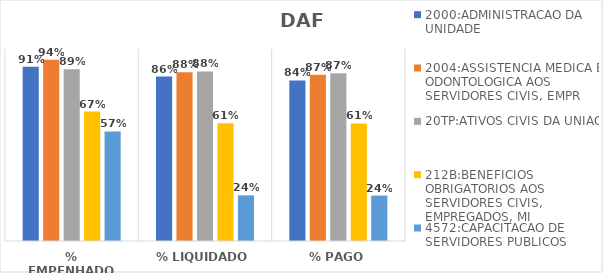
| Category | 2000:ADMINISTRACAO DA UNIDADE | 2004:ASSISTENCIA MEDICA E ODONTOLOGICA AOS SERVIDORES CIVIS, EMPR | 20TP:ATIVOS CIVIS DA UNIAO | 212B:BENEFICIOS OBRIGATORIOS AOS SERVIDORES CIVIS, EMPREGADOS, MI | 4572:CAPACITACAO DE SERVIDORES PUBLICOS FEDERAIS EM PROCESSO DE Q |
|---|---|---|---|---|---|
| % EMPENHADO | 0.908 | 0.945 | 0.895 | 0.674 | 0.57 |
| % LIQUIDADO | 0.857 | 0.879 | 0.883 | 0.613 | 0.238 |
| % PAGO | 0.836 | 0.865 | 0.874 | 0.612 | 0.237 |